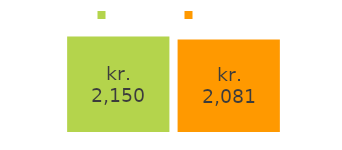
| Category | tjent | brugt |
|---|---|---|
| tjente penge: | 2150 | 2081 |